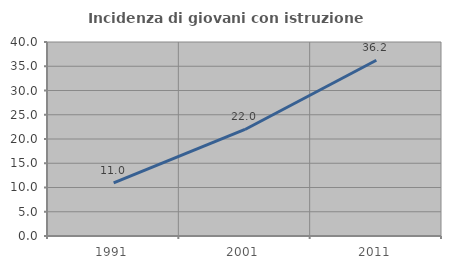
| Category | Incidenza di giovani con istruzione universitaria |
|---|---|
| 1991.0 | 10.97 |
| 2001.0 | 21.967 |
| 2011.0 | 36.232 |